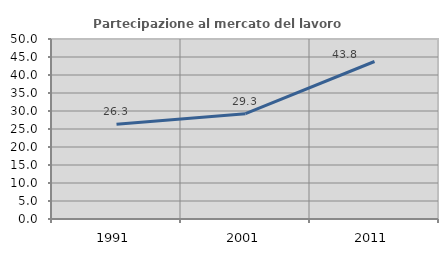
| Category | Partecipazione al mercato del lavoro  femminile |
|---|---|
| 1991.0 | 26.316 |
| 2001.0 | 29.268 |
| 2011.0 | 43.75 |